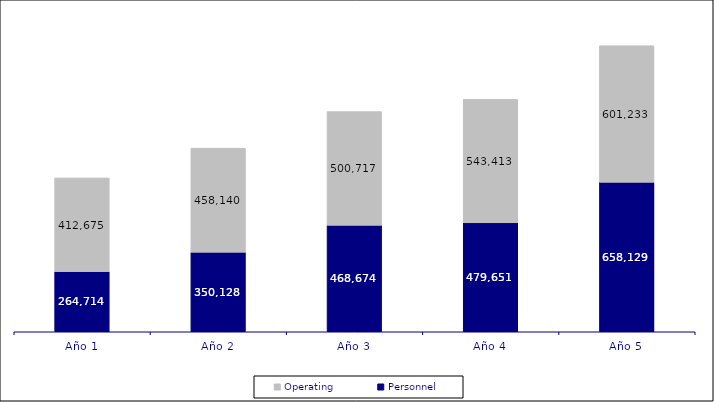
| Category | Personnel | Operating |
|---|---|---|
| Año 1 | 264714.2 | 412675 |
| Año 2 | 350127.84 | 458139.75 |
| Año 3 | 468674.406 | 500717.358 |
| Año 4 | 479650.734 | 543413.258 |
| Año 5 | 658129.358 | 601233.154 |